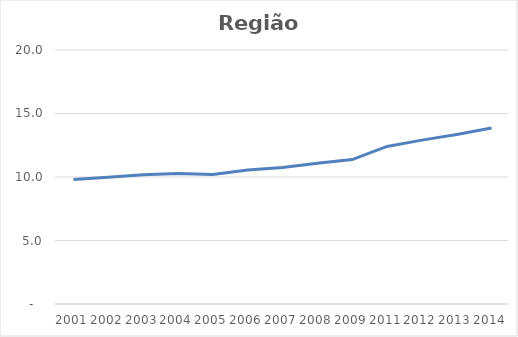
| Category | Total |
|---|---|
| 2001.0 | 9.8 |
| 2002.0 | 9.972 |
| 2003.0 | 10.178 |
| 2004.0 | 10.282 |
| 2005.0 | 10.188 |
| 2006.0 | 10.554 |
| 2007.0 | 10.749 |
| 2008.0 | 11.09 |
| 2009.0 | 11.374 |
| 2011.0 | 12.406 |
| 2012.0 | 12.903 |
| 2013.0 | 13.354 |
| 2014.0 | 13.855 |